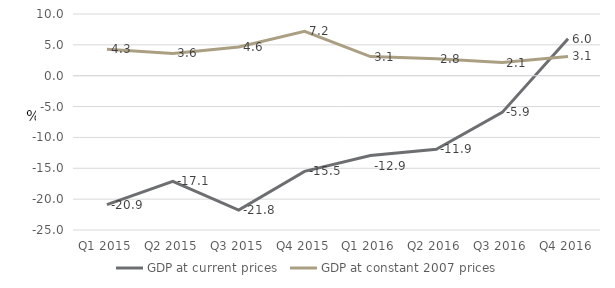
| Category | GDP at current prices  | GDP at constant 2007 prices |
|---|---|---|
| Q1 2015 | -20.901 | 4.29 |
| Q2 2015 | -17.109 | 3.617 |
| Q3 2015 | -21.776 | 4.643 |
| Q4 2015 | -15.505 | 7.2 |
| Q1 2016 | -12.938 | 3.095 |
| Q2 2016 | -11.906 | 2.753 |
| Q3 2016 | -5.947 | 2.135 |
| Q4 2016 | 5.981 | 3.132 |